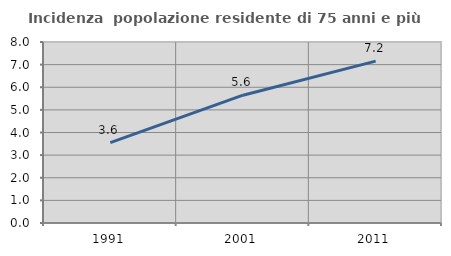
| Category | Incidenza  popolazione residente di 75 anni e più |
|---|---|
| 1991.0 | 3.555 |
| 2001.0 | 5.649 |
| 2011.0 | 7.153 |